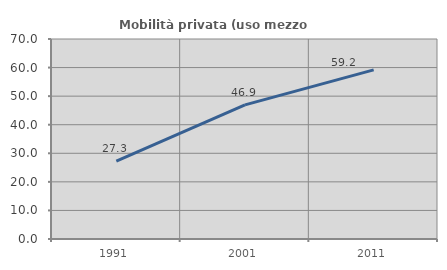
| Category | Mobilità privata (uso mezzo privato) |
|---|---|
| 1991.0 | 27.264 |
| 2001.0 | 46.93 |
| 2011.0 | 59.181 |